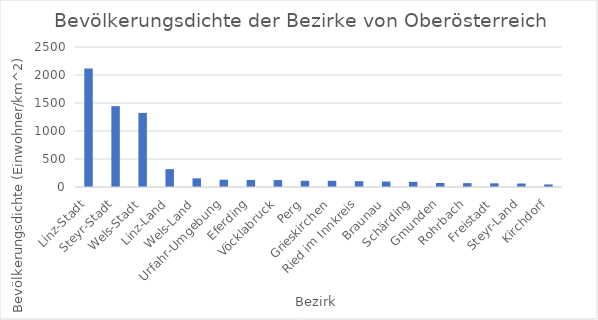
| Category | Series 0 |
|---|---|
| Linz-Stadt | 2115 |
| Steyr-Stadt | 1443 |
| Wels-Stadt | 1323 |
| Linz-Land | 319 |
| Wels-Land | 155 |
| Urfahr-Umgebung | 130 |
| Eferding | 126 |
| Vöcklabruck | 124 |
| Perg | 111 |
| Grieskirchen | 111 |
| Ried im Innkreis | 103 |
| Braunau | 98 |
| Schärding | 92 |
| Gmunden | 71 |
| Rohrbach | 69 |
| Freistadt | 66 |
| Steyr-Land | 62 |
| Kirchdorf | 46 |